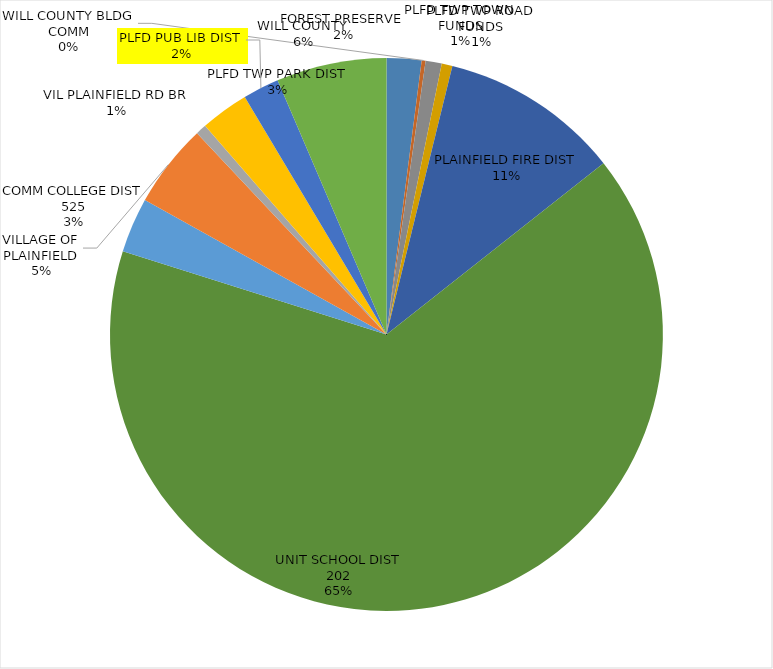
| Category | Series 0 |
|---|---|
| FOREST PRESERVE | 0.194 |
| WILL COUNTY BLDG COMM | 0.022 |
| PLFD TWP TOWN FUNDS | 0.09 |
| PLFD TWP ROAD FUNDS | 0.06 |
| PLAINFIELD FIRE DIST | 1.004 |
| UNIT SCHOOL DIST 202 | 6.241 |
| COMM COLLEGE DIST 525 | 0.306 |
| VILLAGE OF PLAINFIELD | 0.467 |
| VIL PLAINFIELD RD BR | 0.06 |
| PLFD TWP PARK DIST | 0.269 |
| PLFD PUB LIB DIST | 0.202 |
| WILL COUNTY | 0.614 |